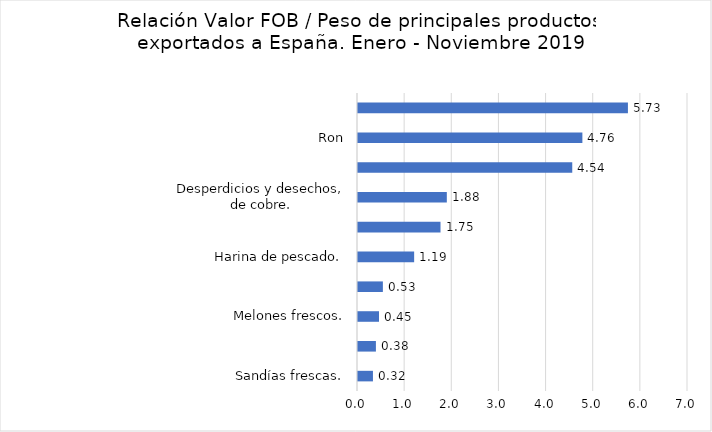
| Category | Series 0 |
|---|---|
| Sandías frescas. | 0.317 |
| Calabazas (zapallos), y calabacines (Cucurbita spp.), frescas o refrigeradas. | 0.38 |
| Melones frescos. | 0.445 |
| Piñas (ananás), frescas o secas. | 0.528 |
| Harina de pescado. | 1.191 |
| Miel de caña. | 1.75 |
| Desperdicios y desechos, de cobre. | 1.884 |
| Camarones y langostinos, de agua fría congelados, excepto ahumados. | 4.545 |
| Ron | 4.76 |
| Camarones, cultivados, sin ahumar, congelados. | 5.726 |